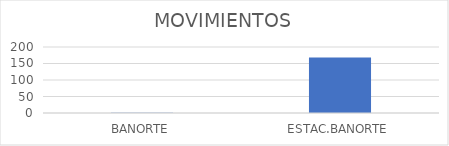
| Category | MOVIMIENTOS |
|---|---|
| BANORTE | 1 |
| ESTAC.BANORTE | 168 |